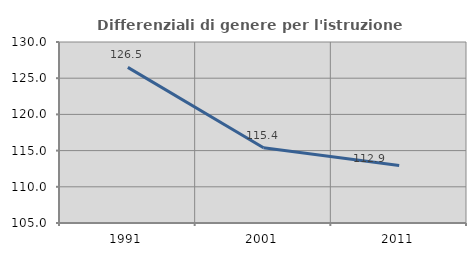
| Category | Differenziali di genere per l'istruzione superiore |
|---|---|
| 1991.0 | 126.501 |
| 2001.0 | 115.388 |
| 2011.0 | 112.942 |